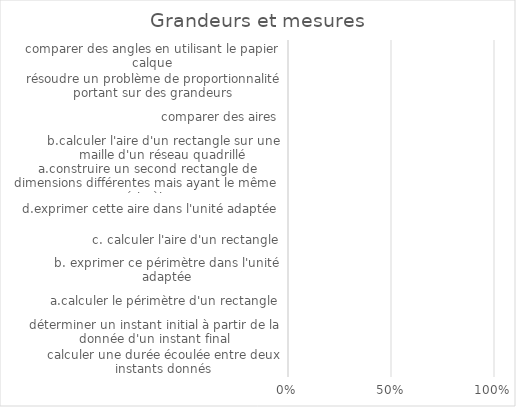
| Category | Series 0 |
|---|---|
| calculer une durée écoulée entre deux instants donnés | 0 |
| déterminer un instant initial à partir de la donnée d'un instant final | 0 |
| a.calculer le périmètre d'un rectangle | 0 |
| b. exprimer ce périmètre dans l'unité adaptée | 0 |
| c. calculer l'aire d'un rectangle | 0 |
| d.exprimer cette aire dans l'unité adaptée | 0 |
| a.construire un second rectangle de dimensions différentes mais ayant le même périmètre | 0 |
| b.calculer l'aire d'un rectangle sur une maille d'un réseau quadrillé | 0 |
| comparer des aires | 0 |
| résoudre un problème de proportionnalité portant sur des grandeurs | 0 |
| comparer des angles en utilisant le papier calque | 0 |